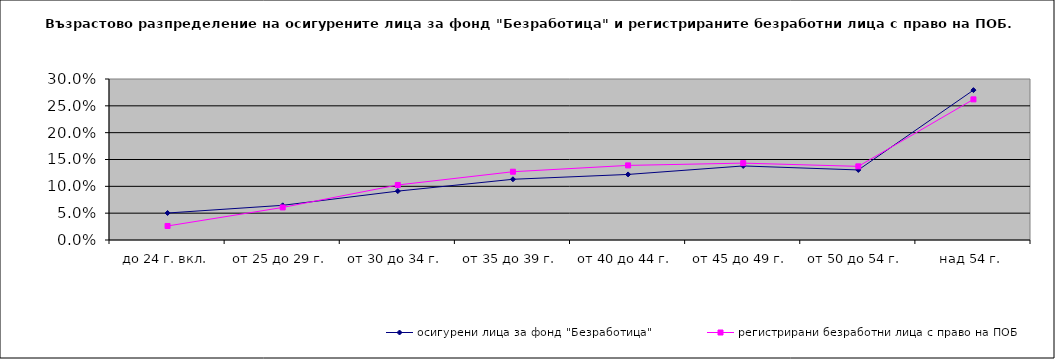
| Category | осигурени лица за фонд "Безработица" | регистрирани безработни лица с право на ПОБ |
|---|---|---|
| до 24 г. вкл. | 0.05 | 0.026 |
| от 25 до 29 г. | 0.065 | 0.061 |
| от 30 до 34 г. | 0.091 | 0.103 |
| от 35 до 39 г. | 0.113 | 0.127 |
| от 40 до 44 г. | 0.122 | 0.139 |
| от 45 до 49 г. | 0.138 | 0.143 |
| от 50 до 54 г. | 0.131 | 0.137 |
| над 54 г. | 0.279 | 0.262 |